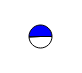
| Category | Series 0 |
|---|---|
| 0 | 4216628 |
| 1 | 4330701 |